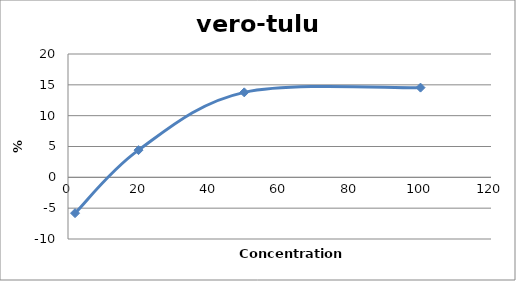
| Category | vero-tulu4 |
|---|---|
| 100.0 | 14.548 |
| 50.0 | 13.78 |
| 20.0 | 4.412 |
| 2.0 | -5.811 |
| nan | 0 |
| nan | 0 |
| nan | 0 |
| nan | 0 |
| nan | 0 |